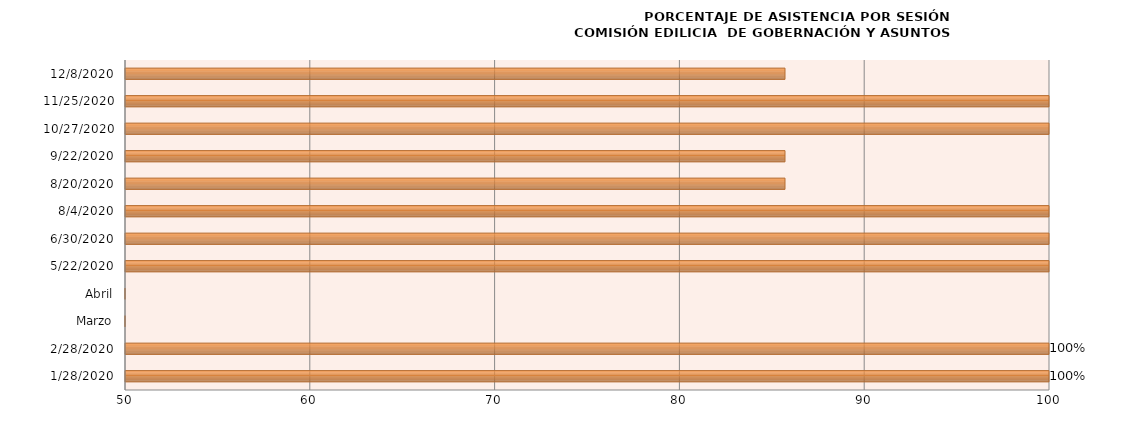
| Category | Series 0 |
|---|---|
| 28/01/2020 | 100 |
| 28/02/2020 | 100 |
| Marzo | 0 |
| Abril | 0 |
| 22/05/2020 | 100 |
| 30/06/2020 | 100 |
| 04/08/2020 | 100 |
| 20/08/2020 | 85.714 |
| 22/09/2020 | 85.714 |
| 27/10/2020 | 100 |
| 25/11/2020 | 100 |
| 08/12/2020 | 85.714 |